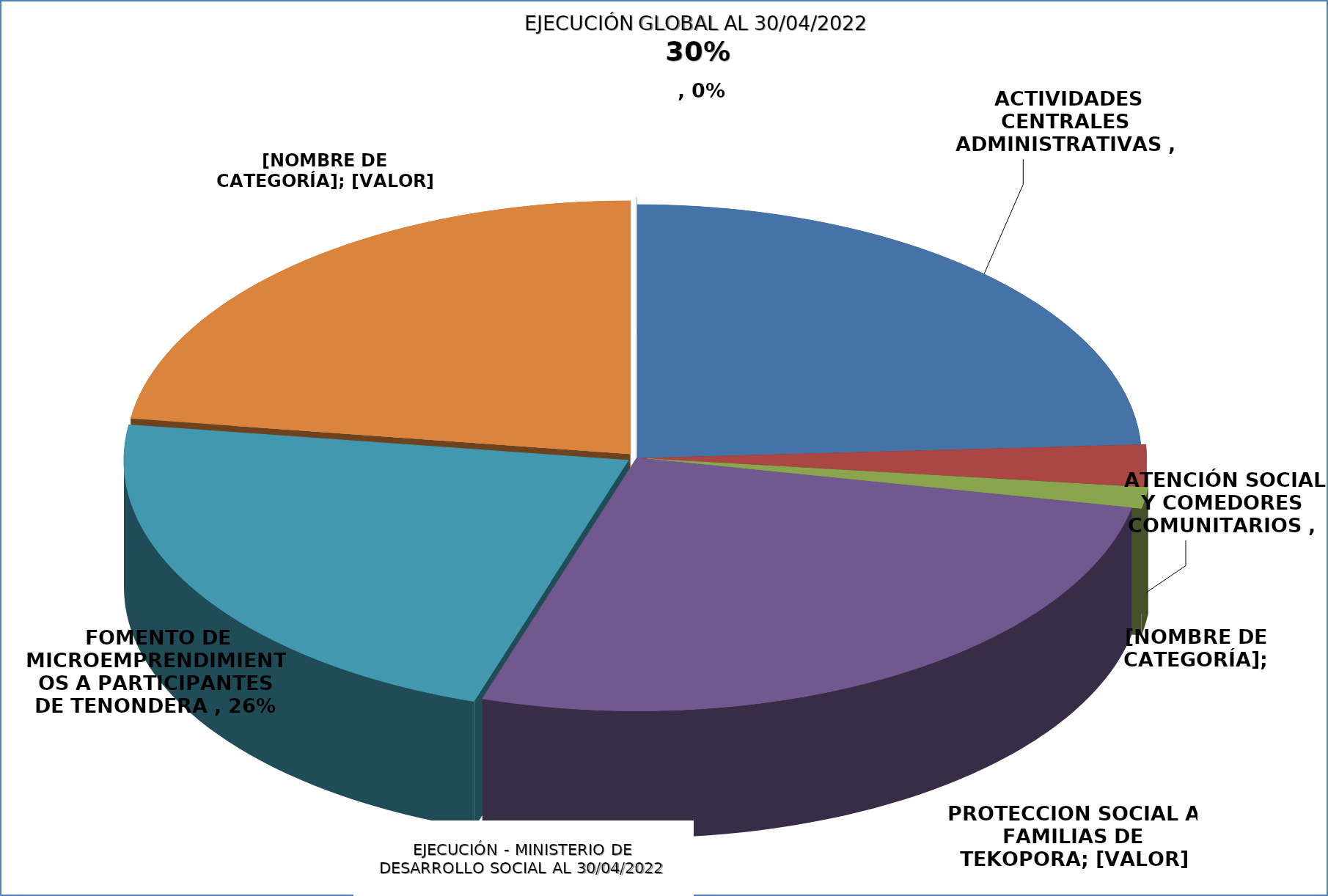
| Category |  EJECUCIÓN - MINISTERIO DE DESARROLLO SOCIAL  |
|---|---|
|  ACTIVIDADES CENTRALES ADMINISTRATIVAS  | 0.287 |
|  ATENCIÓN SOCIAL Y COMEDORES COMUNITARIOS  | 0.032 |
|  ASISTENCIA A PESCADORES POR VEDA PESQUERA  | 0.016 |
|  PROTECCIÓN SOCIAL A FAMILIAS DE TEKOPORA   | 0.318 |
|  FOMENTO DE MICROEMPRENDIMIENTOS A PARTICIPANTES DE TENONDERA  | 0.264 |
|  REGULARIZACIÓN DE TERRITORIOS SOCIALES, TEKOHA  | 0.27 |